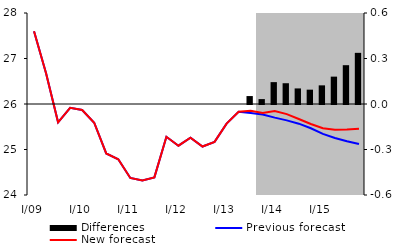
| Category | Differences |
|---|---|
| 0 | 0 |
| 1 | 0 |
| 2 | 0 |
| 3 | 0 |
| 4 | 0 |
| 5 | 0 |
| 6 | 0 |
| 7 | 0 |
| 8 | 0 |
| 9 | 0 |
| 10 | 0 |
| 11 | 0 |
| 12 | 0 |
| 13 | 0 |
| 14 | 0 |
| 15 | 0 |
| 16 | 0 |
| 17 | 0 |
| 18 | 0.052 |
| 19 | 0.032 |
| 20 | 0.144 |
| 21 | 0.137 |
| 22 | 0.103 |
| 23 | 0.095 |
| 24 | 0.123 |
| 25 | 0.18 |
| 26 | 0.256 |
| 27 | 0.337 |